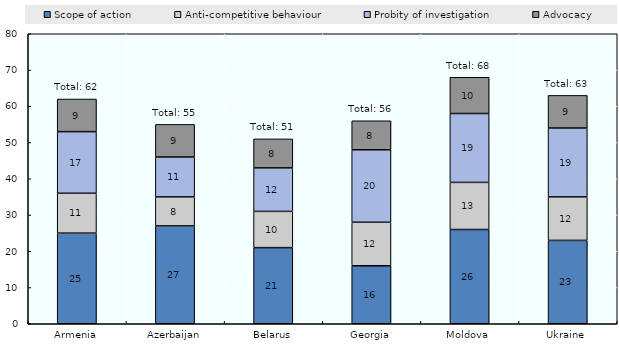
| Category | Scope of action | Anti-competitive behaviour | Probity of investigation | Advocacy |
|---|---|---|---|---|
| Armenia | 25 | 11 | 17 | 9 |
| Azerbaijan | 27 | 8 | 11 | 9 |
| Belarus | 21 | 10 | 12 | 8 |
| Georgia | 16 | 12 | 20 | 8 |
| Moldova | 26 | 13 | 19 | 10 |
| Ukraine | 23 | 12 | 19 | 9 |